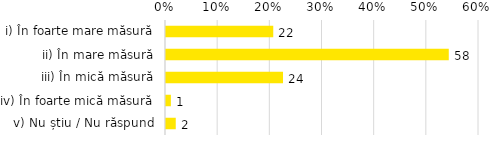
| Category | Total |
|---|---|
| i) În foarte mare măsură | 0.206 |
| ii) În mare măsură | 0.542 |
| iii) În mică măsură | 0.224 |
| iv) În foarte mică măsură | 0.009 |
| v) Nu știu / Nu răspund | 0.019 |